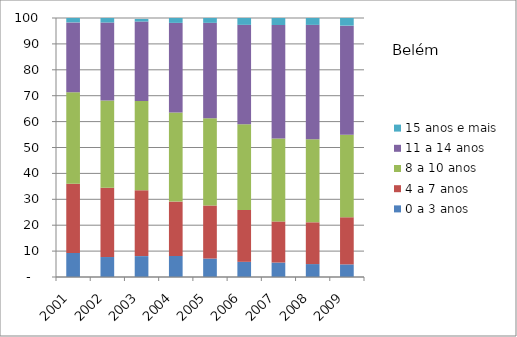
| Category | 0 a 3 anos | 4 a 7 anos | 8 a 10 anos | 11 a 14 anos | 15 anos e mais |
|---|---|---|---|---|---|
| 2001.0 | 9.31 | 26.74 | 35.3 | 26.96 | 1.68 |
| 2002.0 | 7.71 | 26.72 | 33.73 | 30.09 | 1.74 |
| 2003.0 | 8.06 | 25.48 | 34.44 | 30.66 | 1 |
| 2004.0 | 8.1 | 21.02 | 34.43 | 34.56 | 1.9 |
| 2005.0 | 7.12 | 20.49 | 33.68 | 36.85 | 1.87 |
| 2006.0 | 5.86 | 20.01 | 33.1 | 38.39 | 2.64 |
| 2007.0 | 5.58 | 15.87 | 32.02 | 43.83 | 2.69 |
| 2008.0 | 4.99 | 16.13 | 32.04 | 44.19 | 2.66 |
| 2009.0 | 4.87 | 18.2 | 31.88 | 42.1 | 2.96 |